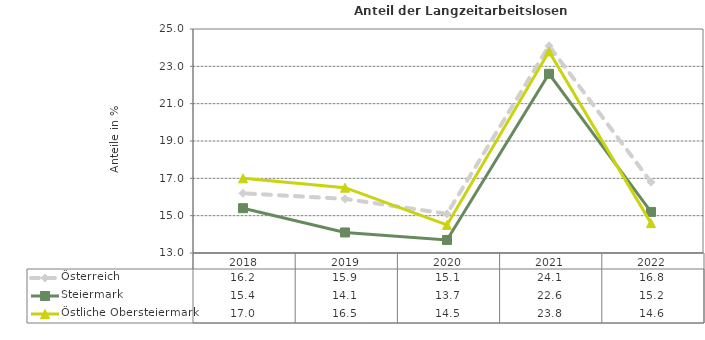
| Category | Österreich | Steiermark | Östliche Obersteiermark |
|---|---|---|---|
| 2022.0 | 16.8 | 15.2 | 14.6 |
| 2021.0 | 24.1 | 22.6 | 23.8 |
| 2020.0 | 15.1 | 13.7 | 14.5 |
| 2019.0 | 15.9 | 14.1 | 16.5 |
| 2018.0 | 16.2 | 15.4 | 17 |